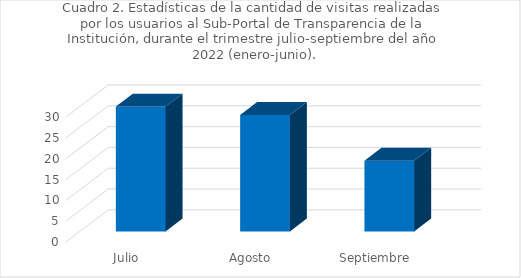
| Category | Series 0 |
|---|---|
| Julio | 30 |
| Agosto | 28 |
| Septiembre | 17 |